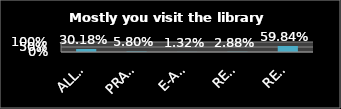
| Category | Series 0 |
|---|---|
| ALL OF THE ABOVE | 0.302 |
| PRACTICAL WORK | 0.058 |
| E-ACCESS | 0.013 |
| READING NEWSPAPERS/MAGAZINE | 0.029 |
| READING THE BOOK | 0.598 |